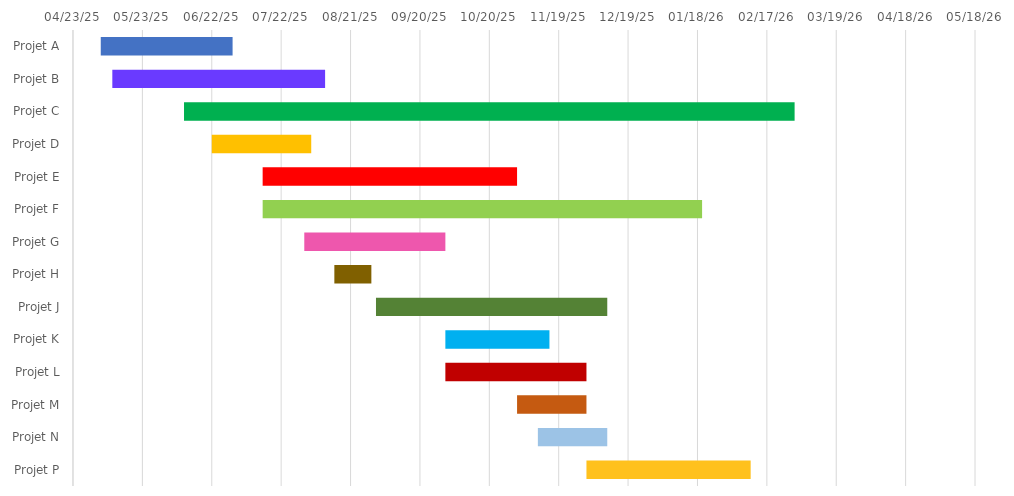
| Category | DÉBUT | Durée |
|---|---|---|
| Projet A | 2025-05-05 | 57 |
| Projet B | 2025-05-10 | 92 |
| Projet C | 2025-06-10 | 264 |
| Projet D | 2025-06-22 | 43 |
| Projet E | 2025-07-14 | 110 |
| Projet F | 2025-07-14 | 190 |
| Projet G | 2025-08-01 | 61 |
| Projet H | 2025-08-14 | 16 |
| Projet J | 2025-09-01 | 100 |
| Projet K | 2025-10-01 | 45 |
| Projet L | 2025-10-01 | 61 |
| Projet M | 2025-11-01 | 30 |
| Projet N | 2025-11-10 | 30 |
| Projet P | 2025-12-01 | 71 |